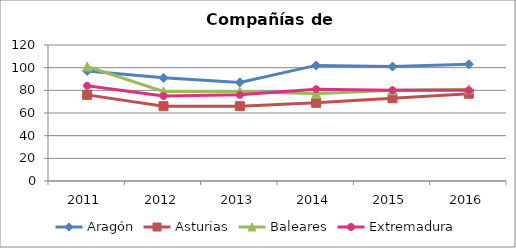
| Category | Aragón | Asturias | Baleares | Extremadura |
|---|---|---|---|---|
| 2011.0 | 97 | 76 | 101 | 84 |
| 2012.0 | 91 | 66 | 79 | 75 |
| 2013.0 | 87 | 66 | 79 | 76 |
| 2014.0 | 102 | 69 | 77 | 81 |
| 2015.0 | 101 | 73 | 80 | 80 |
| 2016.0 | 103 | 77 | 81 | 80 |